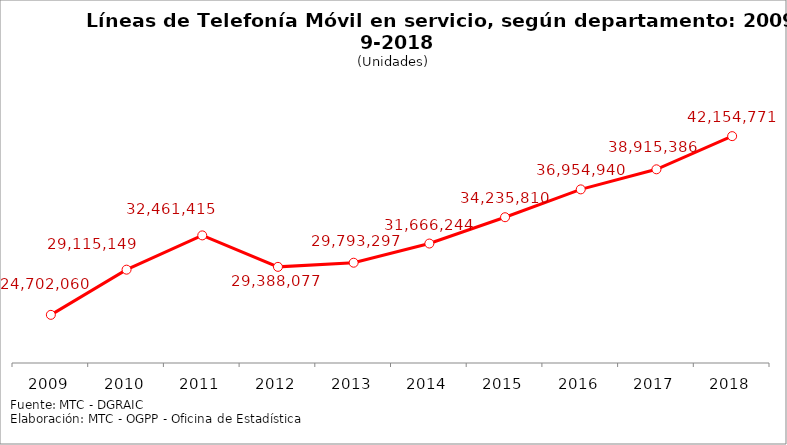
| Category | Series 0 |
|---|---|
| 2009.0 | 24702060 |
| 2010.0 | 29115149 |
| 2011.0 | 32461415 |
| 2012.0 | 29388077 |
| 2013.0 | 29793297 |
| 2014.0 | 31666244 |
| 2015.0 | 34235810 |
| 2016.0 | 36954940 |
| 2017.0 | 38915386 |
| 2018.0 | 42154771 |